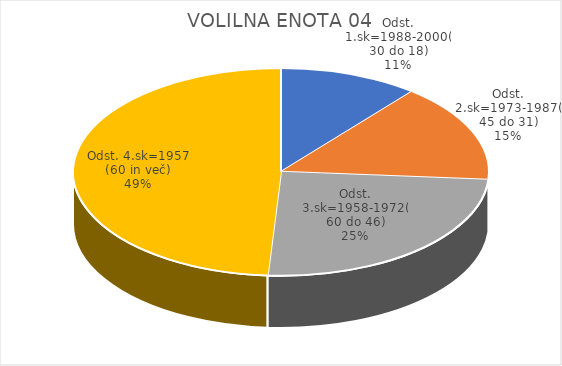
| Category | VOLILNA ENOTA 04 |
|---|---|
| Odst. 1.sk=1988-2000(30 do 18) | 1.71 |
| Odst. 2.sk=1973-1987(45 do 31) | 2.41 |
| Odst. 3.sk=1958-1972(60 do 46) | 3.9 |
| Odst. 4.sk=1957 (60 in več) | 7.7 |